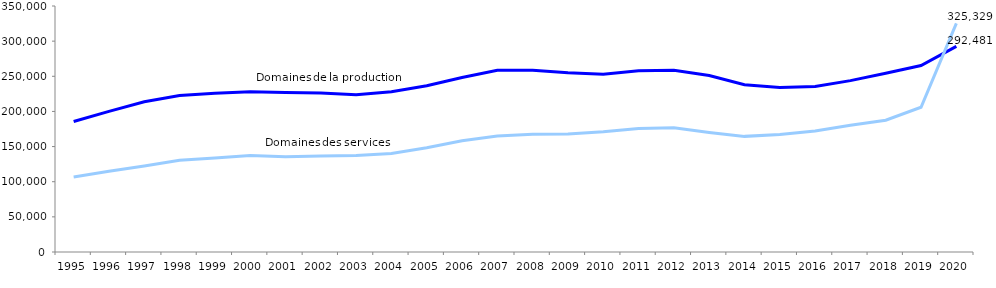
| Category | Domaines de la production | Domaines des services |
|---|---|---|
| 1995 | 185682 | 106784 |
| 1996 | 199995 | 114764 |
| 1997 | 213773 | 122488 |
| 1998 | 222570 | 130580 |
| 1999 | 225802 | 133903 |
| 2000 | 228114 | 137157 |
| 2001 | 226833 | 135458 |
| 2002 | 226307 | 136500 |
| 2003 | 223752 | 137457 |
| 2004 | 228140 | 140059 |
| 2005 | 236666 | 148351 |
| 2006 | 248317 | 158290 |
| 2007 | 258687 | 165089 |
| 2008 | 258550 | 167433 |
| 2009 | 255075 | 167790 |
| 2010 | 252983 | 171022 |
| 2011 | 257900 | 175823 |
| 2012 | 258548 | 176642 |
| 2013 | 251095 | 170059 |
| 2014 | 237932 | 164511 |
| 2015 | 234110 | 167257 |
| 2016 | 235325 | 172057 |
| 2017 | 243845 | 180262 |
| 2018 | 254193 | 187562 |
| 2019 | 265226 | 205977 |
| 2020 | 292481 | 325329 |